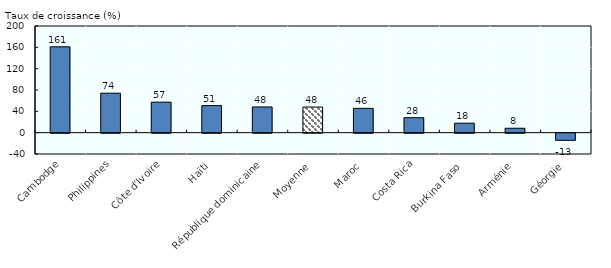
| Category | Taux de croissance |
|---|---|
| Cambodge | 160.944 |
| Philippines | 73.986 |
| Côte d’Ivoire | 57.19 |
| Haïti | 50.761 |
| République dominicaine | 48.19 |
| Moyenne | 48 |
| Maroc | 45.55 |
| Costa Rica | 28.096 |
| Burkina Faso | 17.761 |
| Arménie | 8.289 |
| Géorgie | -13.368 |